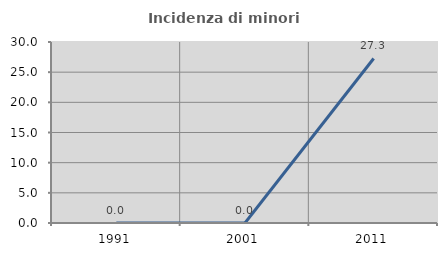
| Category | Incidenza di minori stranieri |
|---|---|
| 1991.0 | 0 |
| 2001.0 | 0 |
| 2011.0 | 27.273 |